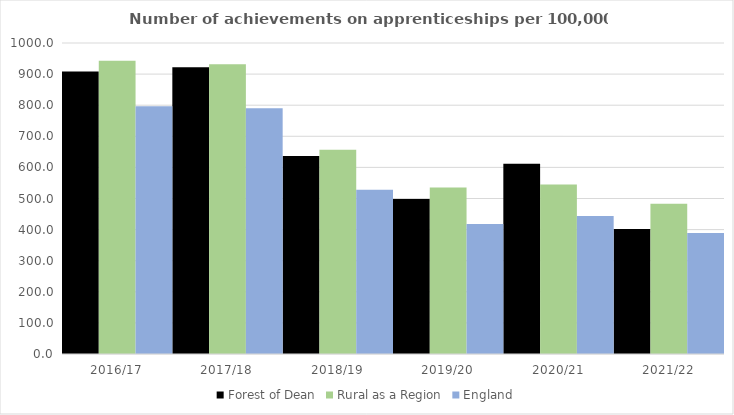
| Category | Forest of Dean | Rural as a Region | England |
|---|---|---|---|
| 2016/17 | 908 | 942.594 | 797 |
| 2017/18 | 922 | 931.709 | 790 |
| 2018/19 | 637 | 656.44 | 528 |
| 2019/20 | 498 | 535.552 | 418 |
| 2020/21 | 612 | 545.333 | 444 |
| 2021/22 | 402 | 482.936 | 389 |